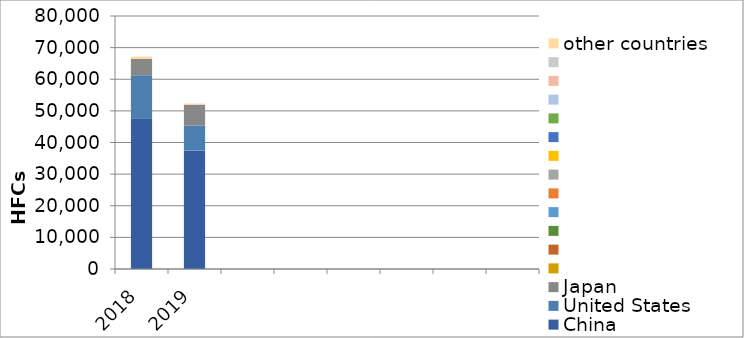
| Category | China | United States | Japan | Series 3 | Series 1 | Series 5 | Series 6 | Series 7 | Series 8 | Series 9 | Series 10 | Series 11 | Series 12 | Series 13 | Series 14 | other countries |
|---|---|---|---|---|---|---|---|---|---|---|---|---|---|---|---|---|
| 2018.0 | 47631.983 | 13623.64 | 5156.473 | 0 | 0 | 0 | 0 | 0 | 0 | 0 | 0 | 0 | 0 | 0 | 0 | 739.606 |
| 2019.0 | 37500.221 | 7803.182 | 6668.598 | 0 | 0 | 0 | 0 | 0 | 0 | 0 | 0 | 0 | 0 | 0 | 0 | 347.826 |